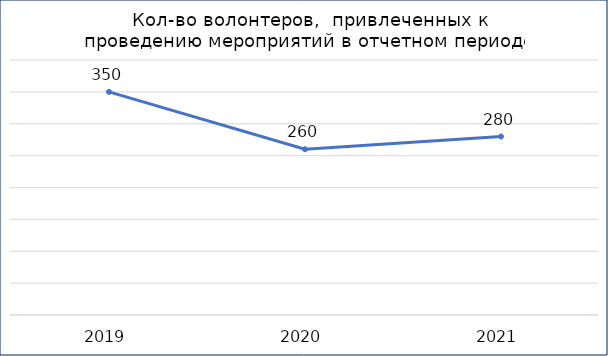
| Category | Кол-во волонтеров |
|---|---|
| 2019.0 | 350 |
| 2020.0 | 260 |
| 2021.0 | 280 |